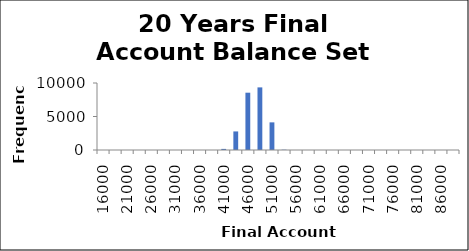
| Category | Frequency |
|---|---|
| 16000.0 | 0 |
| 18500.0 | 0 |
| 21000.0 | 0 |
| 23500.0 | 0 |
| 26000.0 | 0 |
| 28500.0 | 0 |
| 31000.0 | 0 |
| 33500.0 | 0 |
| 36000.0 | 0 |
| 38500.0 | 0 |
| 41000.0 | 164 |
| 43500.0 | 2771 |
| 46000.0 | 8552 |
| 48500.0 | 9345 |
| 51000.0 | 4125 |
| 53500.0 | 43 |
| 56000.0 | 0 |
| 58500.0 | 0 |
| 61000.0 | 0 |
| 63500.0 | 0 |
| 66000.0 | 0 |
| 68500.0 | 0 |
| 71000.0 | 0 |
| 73500.0 | 0 |
| 76000.0 | 0 |
| 78500.0 | 0 |
| 81000.0 | 0 |
| 83500.0 | 0 |
| 86000.0 | 0 |
| More | 0 |